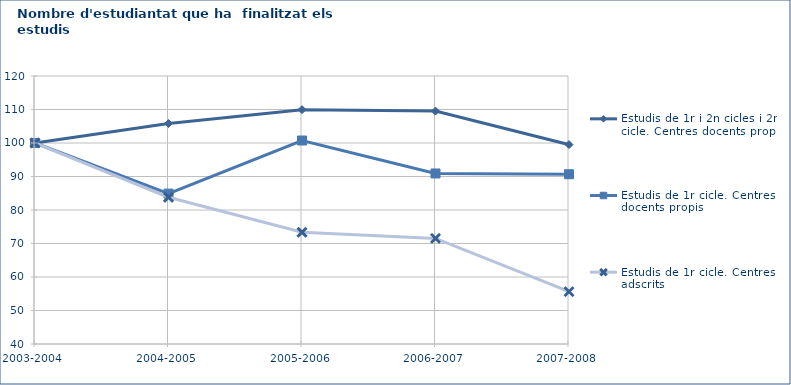
| Category | Estudis de 1r i 2n cicles i 2n cicle. Centres docents propis | Estudis de 1r cicle. Centres docents propis | Estudis de 1r cicle. Centres adscrits |
|---|---|---|---|
| 2003-2004 | 100 | 100 | 100 |
| 2004-2005 | 105.82 | 84.897 | 83.803 |
| 2005-2006 | 109.947 | 100.744 | 73.34 |
| 2006-2007 | 109.524 | 90.904 | 71.529 |
| 2007-2008 | 99.524 | 90.675 | 55.634 |